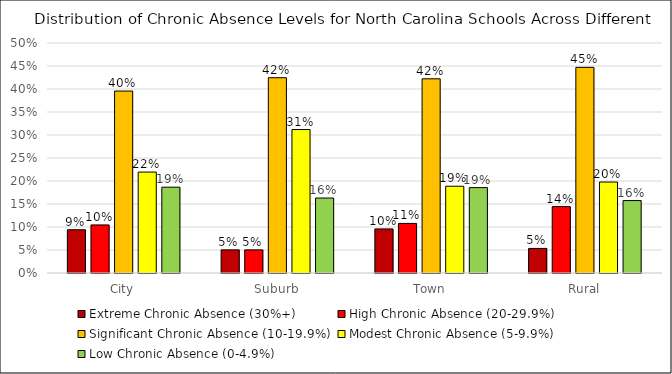
| Category | Extreme Chronic Absence (30%+) | High Chronic Absence (20-29.9%) | Significant Chronic Absence (10-19.9%) | Modest Chronic Absence (5-9.9%) | Low Chronic Absence (0-4.9%) |
|---|---|---|---|---|---|
| City | 0.094 | 0.104 | 0.396 | 0.219 | 0.187 |
| Suburb | 0.05 | 0.05 | 0.425 | 0.312 | 0.163 |
| Town | 0.096 | 0.108 | 0.422 | 0.189 | 0.186 |
| Rural | 0.053 | 0.144 | 0.447 | 0.198 | 0.157 |